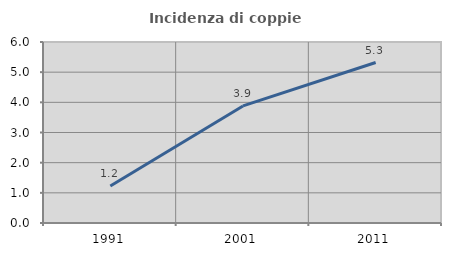
| Category | Incidenza di coppie miste |
|---|---|
| 1991.0 | 1.227 |
| 2001.0 | 3.881 |
| 2011.0 | 5.319 |